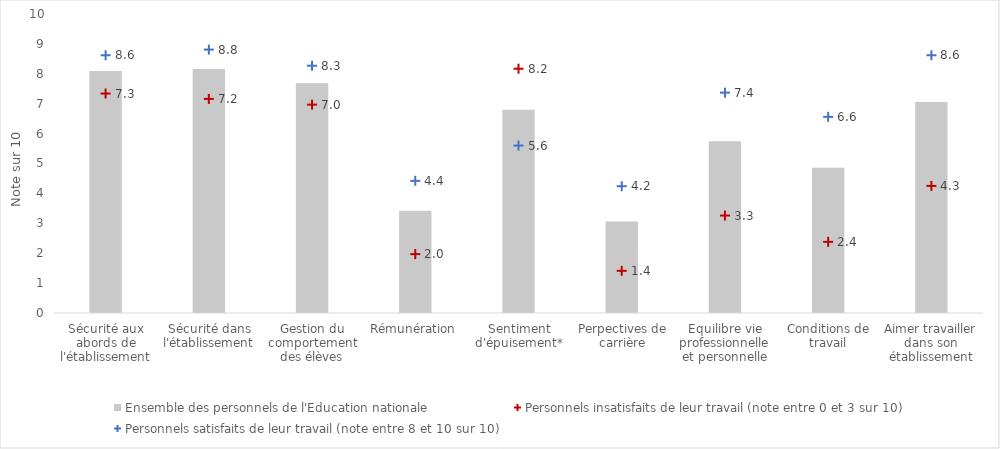
| Category | Ensemble des personnels de l'Education nationale |
|---|---|
| Sécurité aux abords de l'établissement | 8.09 |
| Sécurité dans l'établissement | 8.16 |
| Gestion du comportement des élèves | 7.68 |
| Rémunération | 3.42 |
| Sentiment d'épuisement* | 6.8 |
| Perpectives de carrière | 3.06 |
| Equilibre vie professionnelle et personnelle | 5.74 |
| Conditions de travail | 4.86 |
| Aimer travailler dans son établissement | 7.06 |